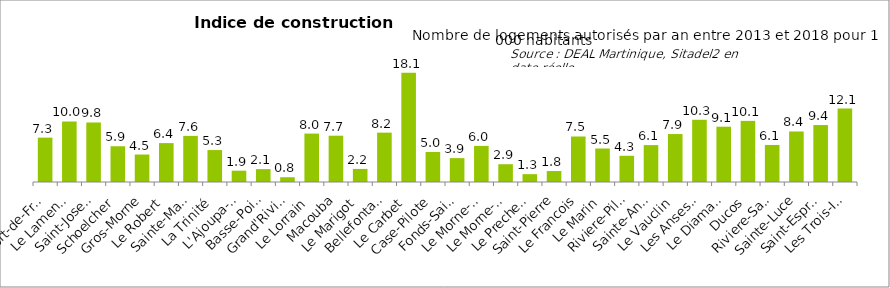
| Category | Series 0 |
|---|---|
| Fort-de-France | 7.334 |
| Le Lamentin | 10.002 |
| Saint-Joseph | 9.837 |
| Schoelcher | 5.908 |
| Gros-Morne | 4.541 |
| Le Robert | 6.431 |
| Sainte-Marie | 7.62 |
| La Trinité | 5.28 |
| L'Ajoupa-Bouillon | 1.871 |
| Basse-Pointe | 2.13 |
| Grand'Riviere | 0.789 |
| Le Lorrain | 8.002 |
| Macouba | 7.652 |
| Le Marigot | 2.161 |
| Bellefontaine | 8.161 |
| Le Carbet | 18.059 |
| Case-Pilote | 4.966 |
| Fonds-Saint-Denis | 3.948 |
| Le Morne-Rouge | 5.965 |
| Le Morne-Vert | 2.938 |
| Le Precheur | 1.298 |
| Saint-Pierre | 1.813 |
| Le Francois | 7.523 |
| Le Marin | 5.535 |
| Riviere-Pilote | 4.335 |
| Sainte-Anne | 6.099 |
| Le Vauclin | 7.924 |
| Les Anses-d'Arlet | 10.284 |
| Le Diamant | 9.143 |
| Ducos | 10.104 |
| Riviere-Salee | 6.123 |
| Sainte-Luce | 8.35 |
| Saint-Esprit | 9.416 |
| Les Trois-Ilets | 12.141 |